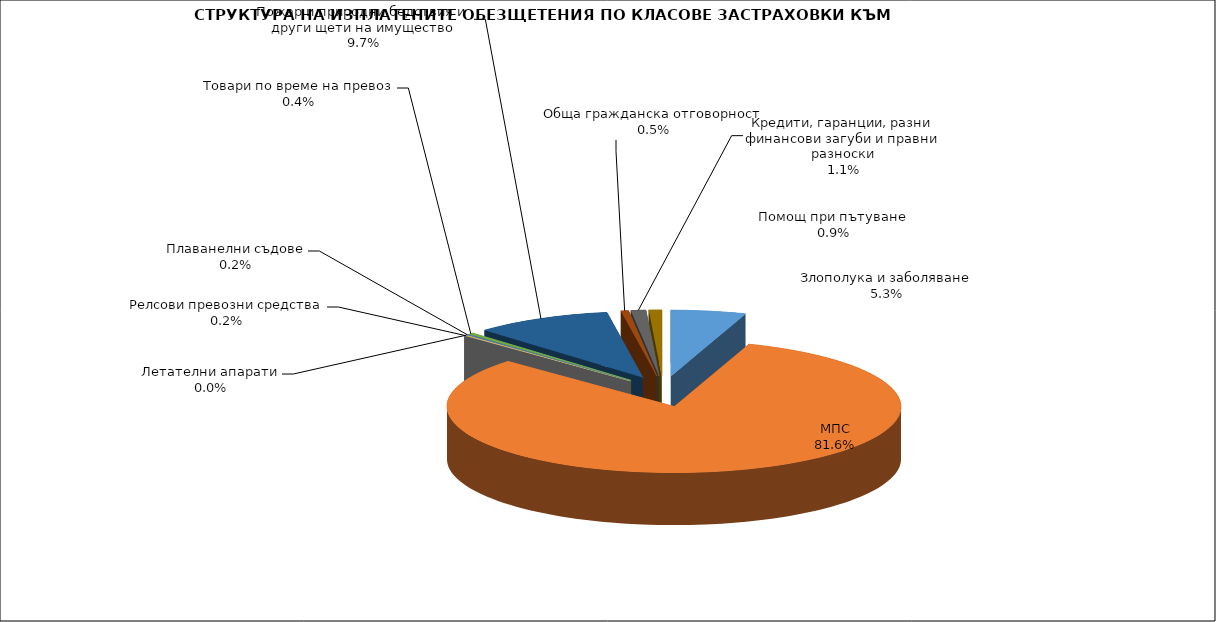
| Category | Series 0 |
|---|---|
| Злополука и заболяване | 0.053 |
| МПС | 0.816 |
| Релсови превозни средства | 0.002 |
| Летателни апарати | 0 |
| Плаванелни съдове | 0.002 |
| Товари по време на превоз | 0.004 |
| Пожар и природни бедствия и други щети на имущество | 0.097 |
| Обща гражданска отговорност | 0.005 |
| Кредити, гаранции, разни финансови загуби и правни разноски | 0.011 |
| Помощ при пътуване | 0.009 |